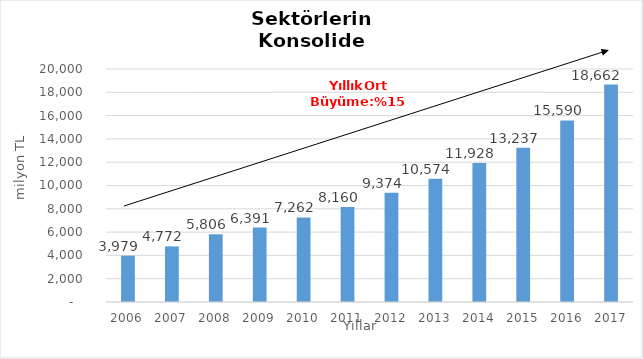
| Category | Toplam |
|---|---|
| 2006.0 | 3978.535 |
| 2007.0 | 4771.635 |
| 2008.0 | 5805.717 |
| 2009.0 | 6391.175 |
| 2010.0 | 7262.062 |
| 2011.0 | 8159.605 |
| 2012.0 | 9374.412 |
| 2013.0 | 10573.674 |
| 2014.0 | 11928 |
| 2015.0 | 13237 |
| 2016.0 | 15590 |
| 2017.0 | 18662 |